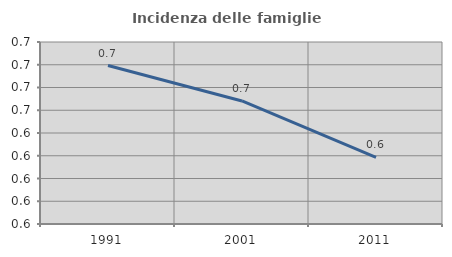
| Category | Incidenza delle famiglie numerose |
|---|---|
| 1991.0 | 0.699 |
| 2001.0 | 0.668 |
| 2011.0 | 0.619 |